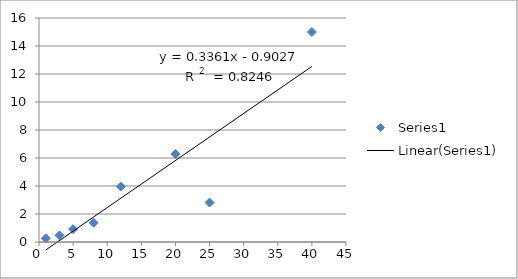
| Category | Series 0 |
|---|---|
| 1.0 | 0.261 |
| 3.0 | 0.471 |
| 5.0 | 0.92 |
| 8.0 | 1.377 |
| 12.0 | 3.957 |
| 20.0 | 6.288 |
| 25.0 | 2.817 |
| 40.0 | 15 |